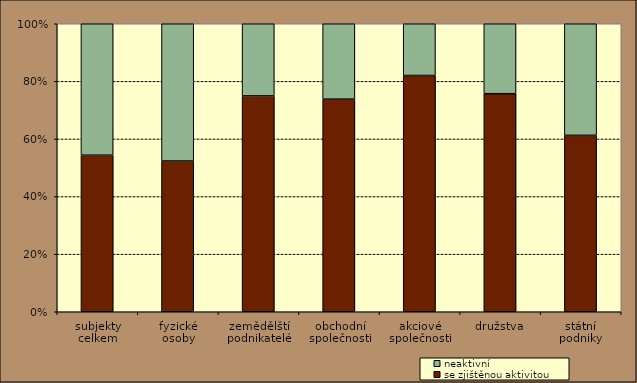
| Category | se zjištěnou aktivitou | neaktivní |
|---|---|---|
| subjekty
celkem | 54.366 | 45.634 |
| fyzické
osoby | 52.344 | 47.656 |
| zemědělští podnikatelé | 74.95 | 25.05 |
| obchodní
společnosti | 73.832 | 26.168 |
| akciové
společnosti | 82.033 | 17.967 |
| družstva | 75.721 | 24.279 |
| státní
podniky | 61.261 | 38.739 |